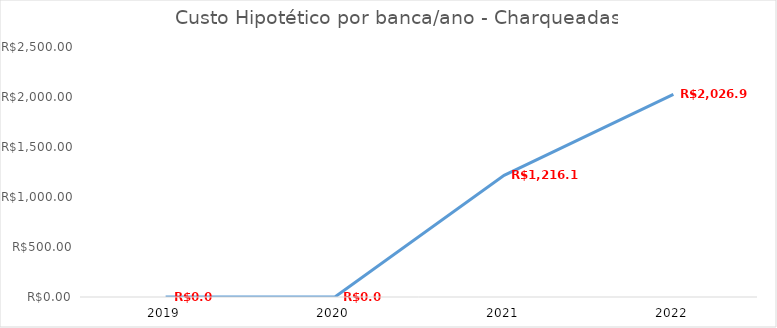
| Category | Series 0 |
|---|---|
| 2019.0 | 0 |
| 2020.0 | 0 |
| 2021.0 | 1216.17 |
| 2022.0 | 2026.95 |